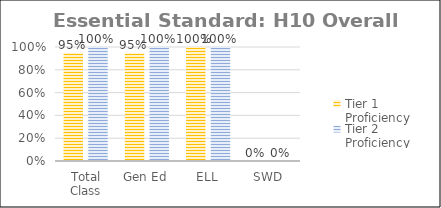
| Category | Tier 1 Proficiency | Tier 2 Proficiency |
|---|---|---|
| Total Class | 0.946 | 1 |
| Gen Ed | 0.945 | 1 |
| ELL | 1 | 1 |
| SWD | 0 | 0 |